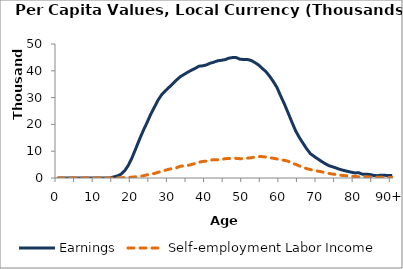
| Category | Earnings | Self-employment Labor Income |
|---|---|---|
| 0 | 0 | 0 |
|  | 0 | 0 |
| 2 | 0 | 0 |
| 3 | 0 | 0 |
| 4 | 0 | 0 |
| 5 | 0 | 0 |
| 6 | 0 | 0 |
| 7 | 0 | 0 |
| 8 | 0 | 0 |
| 9 | 0 | 0 |
| 10 | 0 | 0 |
| 11 | 0 | 0 |
| 12 | 0 | 0 |
| 13 | 0 | 0 |
| 14 | 0 | 0 |
| 15 | 392.031 | 52.867 |
| 16 | 749.824 | 75.833 |
| 17 | 1436.447 | 108.776 |
| 18 | 2723.374 | 156.03 |
| 19 | 4791.077 | 223.811 |
| 20 | 7667.205 | 321.038 |
| 21 | 11028.742 | 446.523 |
| 22 | 14483.49 | 606.956 |
| 23 | 17716.404 | 834.992 |
| 24 | 20648.314 | 1166.106 |
| 25 | 23765.327 | 1468.049 |
| 26 | 26450.64 | 1677.298 |
| 27 | 29107.416 | 2133.368 |
| 28 | 31172.117 | 2531.704 |
| 29 | 32543.88 | 2922.224 |
| 30 | 33923.39 | 3306.827 |
| 31 | 35221.102 | 3573.49 |
| 32 | 36637.663 | 3858.106 |
| 33 | 37825.597 | 4392.007 |
| 34 | 38649.986 | 4552.32 |
| 35 | 39514.115 | 4713.966 |
| 36 | 40228.524 | 5020.621 |
| 37 | 40924.198 | 5464.716 |
| 38 | 41722.304 | 5895.179 |
| 39 | 41859.817 | 6167.517 |
| 40 | 42202.68 | 6301.248 |
| 41 | 42829.362 | 6689.456 |
| 42 | 43216.237 | 6804.375 |
| 43 | 43734.576 | 6795.672 |
| 44 | 43918.069 | 6882.132 |
| 45 | 44157.807 | 7212.419 |
| 46 | 44700.748 | 7262.787 |
| 47 | 44934.751 | 7410.137 |
| 48 | 44947.488 | 7326.981 |
| 49 | 44338.533 | 7200.544 |
| 50 | 44226.997 | 7231.761 |
| 51 | 44240.666 | 7406.937 |
| 52 | 43880.497 | 7535.552 |
| 53 | 43123.979 | 7804.134 |
| 54 | 42216.129 | 8011.168 |
| 55 | 40936.149 | 7974.27 |
| 56 | 39718.045 | 7833.413 |
| 57 | 38006.4 | 7578.357 |
| 58 | 36007.748 | 7371.583 |
| 59 | 33754.114 | 7101.504 |
| 60 | 30578.776 | 6796.755 |
| 61 | 27579.937 | 6600.887 |
| 62 | 24272.686 | 6261.719 |
| 63 | 20896.982 | 5490.132 |
| 64 | 17642.389 | 5132.334 |
| 65 | 15137.406 | 4507.639 |
| 66 | 12979.105 | 4049.992 |
| 67 | 10870.016 | 3492.533 |
| 68 | 9069.029 | 3148.154 |
| 69 | 8052.047 | 2877.019 |
| 70 | 7100.77 | 2572.511 |
| 71 | 6169.331 | 2316.278 |
| 72 | 5322.066 | 1955.057 |
| 73 | 4570.647 | 1672.969 |
| 74 | 4168.002 | 1479.917 |
| 75 | 3677.84 | 1262.378 |
| 76 | 3198.599 | 1076.816 |
| 77 | 2810.766 | 918.531 |
| 78 | 2469.951 | 783.512 |
| 79 | 2170.419 | 668.34 |
| 80 | 1889.337 | 555.858 |
| 81 | 1958.043 | 463.119 |
| 82 | 1410.007 | 426.334 |
| 83 | 1417.857 | 424.808 |
| 84 | 1313.075 | 370.983 |
| 85 | 973.409 | 323.977 |
| 86 | 858.31 | 285.528 |
| 87 | 1044.9 | 247.079 |
| 88 | 993.72 | 215.773 |
| 89 | 944.725 | 188.434 |
| 90+ | 898.421 | 164.558 |